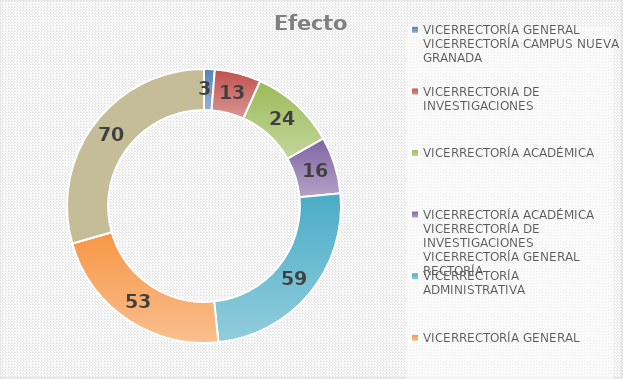
| Category | Efectos |
|---|---|
| VICERRECTORÍA GENERAL
VICERRECTORÍA CAMPUS NUEVA GRANADA | 3 |
| VICERRECTORIA DE INVESTIGACIONES | 13 |
| VICERRECTORÍA ACADÉMICA | 24 |
| VICERRECTORÍA ACADÉMICA
VICERRECTORÍA DE INVESTIGACIONES
VICERRECTORÍA GENERAL
RECTORÍA


 | 16 |
| VICERRECTORÍA ADMINISTRATIVA | 59 |
| VICERRECTORÍA GENERAL | 53 |
| RECTORÍA | 70 |